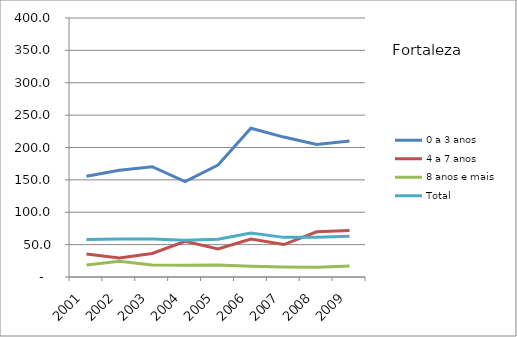
| Category | 0 a 3 anos | 4 a 7 anos | 8 anos e mais | Total |
|---|---|---|---|---|
| 2001.0 | 155.5 | 35.5 | 18.4 | 57.8 |
| 2002.0 | 164.7 | 29.3 | 24.2 | 58.7 |
| 2003.0 | 170.4 | 36.4 | 18.7 | 58.8 |
| 2004.0 | 147.5 | 55 | 18.3 | 56.8 |
| 2005.0 | 172.8 | 43.4 | 18.7 | 58.2 |
| 2006.0 | 229.8 | 58.6 | 16.7 | 67.8 |
| 2007.0 | 216.1 | 50.1 | 15.5 | 61.2 |
| 2008.0 | 204.6 | 69.8 | 15 | 61.4 |
| 2009.0 | 210.2 | 71.8 | 17.1 | 63.1 |